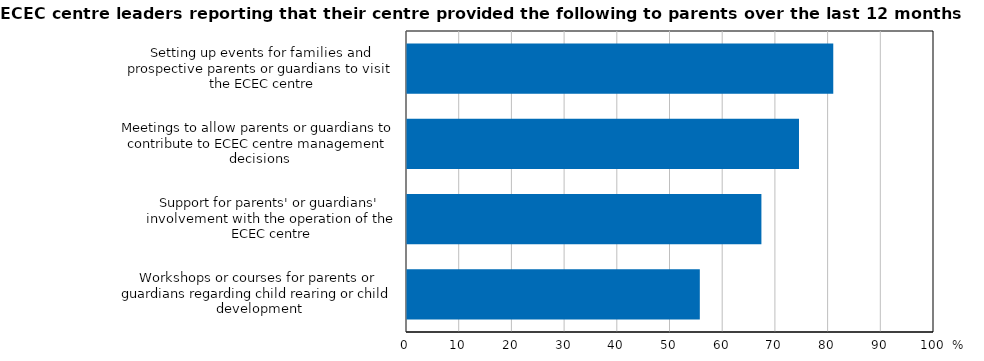
| Category | LEADER |
|---|---|
| Workshops or courses for parents or guardians regarding child rearing or child development | 55.564 |
| Support for parents' or guardians' involvement with the operation of the ECEC centre | 67.25 |
| Meetings to allow parents or guardians to contribute to ECEC centre management decisions | 74.381 |
| Setting up events for families and prospective parents or guardians to visit the ECEC centre | 80.886 |